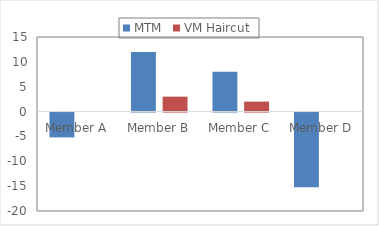
| Category | MTM | VM Haircut |
|---|---|---|
| Member A | -5 | 0 |
| Member B | 12 | 3 |
| Member C | 8 | 2 |
| Member D | -15 | 0 |